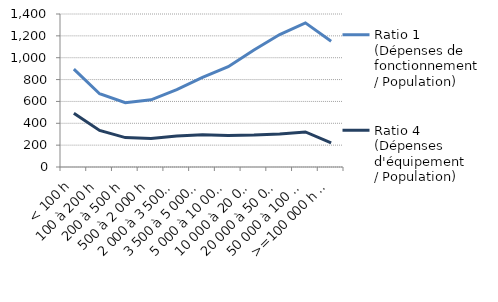
| Category | Ratio 1 
(Dépenses de fonctionnement 
/ Population) | Ratio 4 
(Dépenses d'équipement 
/ Population) |
|---|---|---|
| < 100 h | 896.022 | 492.668 |
| 100 à 200 h | 670.267 | 334.329 |
| 200 à 500 h | 588.364 | 269.019 |
| 500 à 2 000 h | 615.146 | 260.289 |
| 2 000 à 3 500 h | 708.379 | 282.717 |
| 3 500 à 5 000 h | 819.566 | 293.95 |
| 5 000 à 10 000 h | 917.703 | 287.721 |
| 10 000 à 20 000 h | 1071.113 | 291.729 |
| 20 000 à 50 000 h | 1212.13 | 301.054 |
| 50 000 à 100 000 h | 1318.596 | 320.65 |
| >=100 000 h hors Paris | 1151.416 | 221.786 |